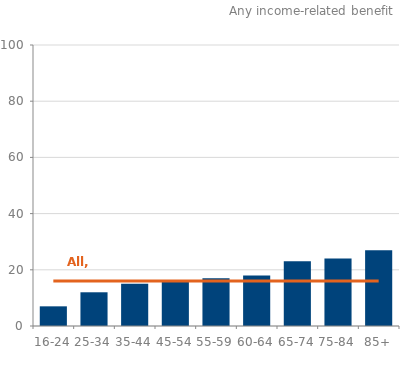
| Category | Series 0 |
|---|---|
| 0 | 7 |
| 1 | 12 |
| 2 | 15 |
| 3 | 16 |
| 4 | 17 |
| 5 | 18 |
| 6 | 23 |
| 7 | 24 |
| 8 | 27 |